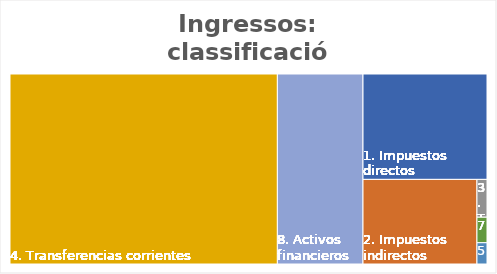
| Category | Series 0 |
|---|---|
| 1. Impuestos directos | 0.144 |
| 2. Impuestos indirectos | 0.106 |
| 3. Tasas, precios públicos y otros ing. | 0.004 |
| 4. Transferencias corrientes | 0.561 |
| 5. Ingresos patrimoniales | 0.002 |
| 7. Transferencias de capital | 0.003 |
| 8. Activos financieros | 0.179 |